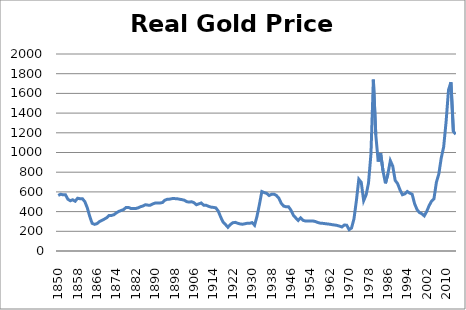
| Category | Series 0 |
|---|---|
| 1850 | 564.365 |
| 1851 | 576.605 |
| 1852 | 570.42 |
| 1853 | 570.42 |
| 1854 | 525.21 |
| 1855 | 510.094 |
| 1856 | 520.073 |
| 1857 | 505.247 |
| 1858 | 535.859 |
| 1859 | 530.513 |
| 1860 | 530.513 |
| 1861 | 500.435 |
| 1862 | 438.396 |
| 1863 | 351.324 |
| 1864 | 280.675 |
| 1865 | 270.657 |
| 1866 | 277.743 |
| 1867 | 298.017 |
| 1868 | 310.23 |
| 1869 | 323.464 |
| 1870 | 337.876 |
| 1871 | 360.862 |
| 1872 | 361.052 |
| 1873 | 368.587 |
| 1874 | 387.407 |
| 1875 | 402.082 |
| 1876 | 411.449 |
| 1877 | 421.222 |
| 1878 | 442.319 |
| 1879 | 442.319 |
| 1880 | 431.513 |
| 1881 | 431.513 |
| 1882 | 431.513 |
| 1883 | 438.628 |
| 1884 | 449.798 |
| 1885 | 457.535 |
| 1886 | 469.702 |
| 1887 | 465.591 |
| 1888 | 465.591 |
| 1889 | 477.892 |
| 1890 | 486.951 |
| 1891 | 487.465 |
| 1892 | 487.465 |
| 1893 | 491.968 |
| 1894 | 515.307 |
| 1895 | 525.21 |
| 1896 | 526.597 |
| 1897 | 531.914 |
| 1898 | 531.914 |
| 1899 | 530.793 |
| 1900 | 526.042 |
| 1901 | 521.446 |
| 1902 | 516.123 |
| 1903 | 500.964 |
| 1904 | 496.555 |
| 1905 | 500.171 |
| 1906 | 490.411 |
| 1907 | 469.702 |
| 1908 | 478.397 |
| 1909 | 487.465 |
| 1910 | 465.1 |
| 1911 | 465.1 |
| 1912 | 453.394 |
| 1913 | 445.556 |
| 1914 | 442.732 |
| 1915 | 438.349 |
| 1916 | 406.177 |
| 1917 | 345.885 |
| 1918 | 293.2 |
| 1919 | 268.852 |
| 1920 | 241.067 |
| 1921 | 268.046 |
| 1922 | 286.706 |
| 1923 | 290.675 |
| 1924 | 282.086 |
| 1925 | 274.972 |
| 1926 | 271.733 |
| 1927 | 276.552 |
| 1928 | 281.677 |
| 1929 | 281.267 |
| 1930 | 288.284 |
| 1931 | 261.669 |
| 1932 | 352.092 |
| 1933 | 472.198 |
| 1934 | 603.554 |
| 1935 | 592.89 |
| 1936 | 584.862 |
| 1937 | 563.259 |
| 1938 | 576.236 |
| 1939 | 577.315 |
| 1940 | 563.699 |
| 1941 | 536.856 |
| 1942 | 484.158 |
| 1943 | 456.172 |
| 1944 | 448.397 |
| 1945 | 449.571 |
| 1946 | 414.989 |
| 1947 | 362.883 |
| 1948 | 335.779 |
| 1949 | 310.429 |
| 1950 | 335.876 |
| 1951 | 311.331 |
| 1952 | 304.401 |
| 1953 | 304.217 |
| 1954 | 303.688 |
| 1955 | 304.735 |
| 1956 | 299.91 |
| 1957 | 289.973 |
| 1958 | 283.156 |
| 1959 | 281.21 |
| 1960 | 277.799 |
| 1961 | 274.855 |
| 1962 | 271.971 |
| 1963 | 267.349 |
| 1964 | 263.974 |
| 1965 | 259.932 |
| 1966 | 252.784 |
| 1967 | 243.959 |
| 1968 | 263.354 |
| 1969 | 262.235 |
| 1970 | 216.435 |
| 1971 | 233.831 |
| 1972 | 325.838 |
| 1973 | 511.385 |
| 1974 | 728.266 |
| 1975 | 697.079 |
| 1976 | 511.105 |
| 1977 | 568.769 |
| 1978 | 691.553 |
| 1979 | 982.655 |
| 1980 | 1740.06 |
| 1981 | 1179.805 |
| 1982 | 908.4 |
| 1983 | 992.483 |
| 1984 | 810.043 |
| 1985 | 686.852 |
| 1986 | 782.805 |
| 1987 | 917.372 |
| 1988 | 861.218 |
| 1989 | 716.341 |
| 1990 | 684.097 |
| 1991 | 619.84 |
| 1992 | 571.334 |
| 1993 | 580.462 |
| 1994 | 604.087 |
| 1995 | 587.118 |
| 1996 | 576.252 |
| 1997 | 480.835 |
| 1998 | 420.853 |
| 1999 | 390.404 |
| 2000 | 377.884 |
| 2001 | 356.805 |
| 2002 | 401.392 |
| 2003 | 460.426 |
| 2004 | 505.651 |
| 2005 | 530.93 |
| 2006 | 697.95 |
| 2007 | 781.836 |
| 2008 | 944.32 |
| 2009 | 1056.464 |
| 2010 | 1311.87 |
| 2011 | 1635.169 |
| 2012 | 1713.374 |
| 2013 | 1214.771 |
| 2014 | 1184.86 |